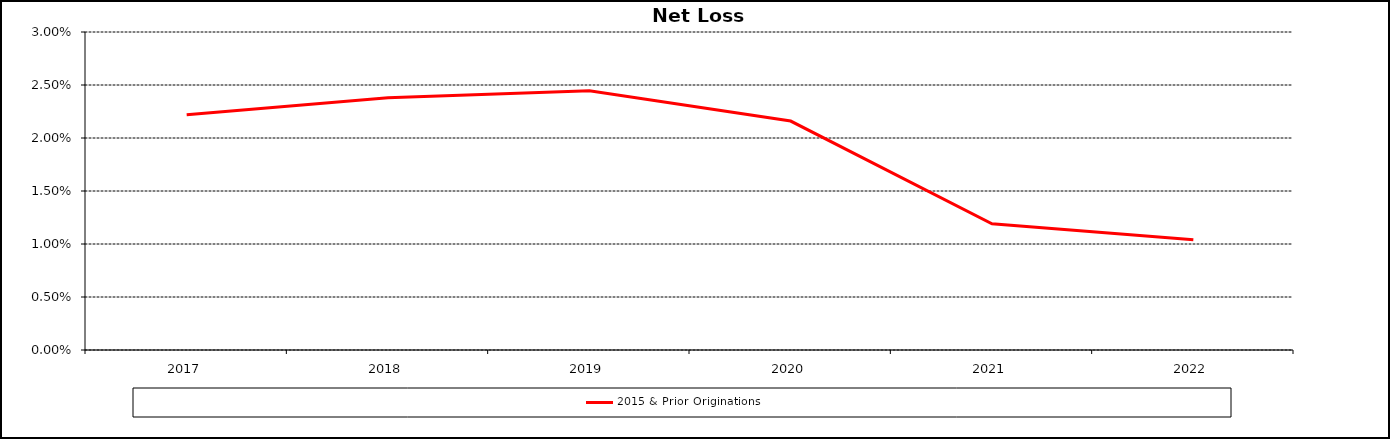
| Category | 2015 & Prior Originations |
|---|---|
| 2017.0 | 0.022 |
| 2018.0 | 0.024 |
| 2019.0 | 0.024 |
| 2020.0 | 0.022 |
| 2021.0 | 0.012 |
| 2022.0 | 0.01 |